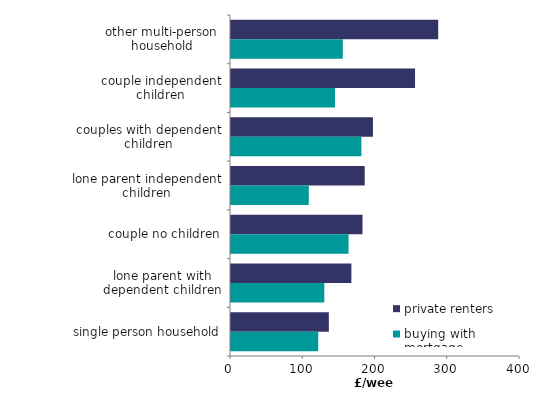
| Category | private renters | buying with mortgage |
|---|---|---|
| other multi-person  household | 286.768 | 154.753 |
| couple independent children | 254.725 | 143.923 |
| couples with dependent children | 196.441 | 180.483 |
| lone parent independent children | 185.033 | 107.653 |
| couple no children | 181.997 | 162.712 |
| lone parent with dependent children | 166.612 | 129.143 |
| single person household | 135.417 | 120.729 |